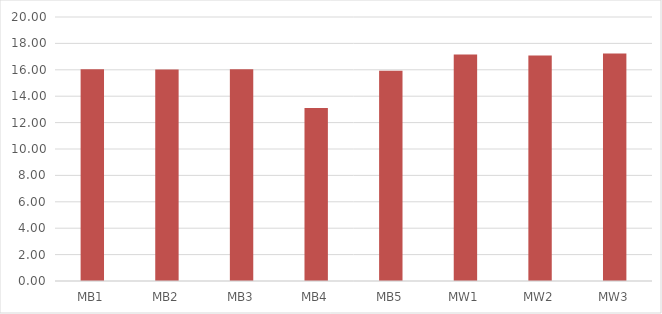
| Category | Series 0 |
|---|---|
| MB1 | 16.05 |
| MB2 | 16.03 |
| MB3 | 16.05 |
| MB4 | 13.1 |
| MB5 | 15.92 |
| MW1 | 17.16 |
| MW2 | 17.08 |
| MW3 | 17.23 |